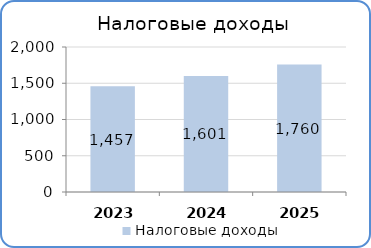
| Category | Налоги на доходы физических лиц |
|---|---|
| 2023 | 1457100 |
| 2024 | 1600800 |
| 2025 | 1760200 |